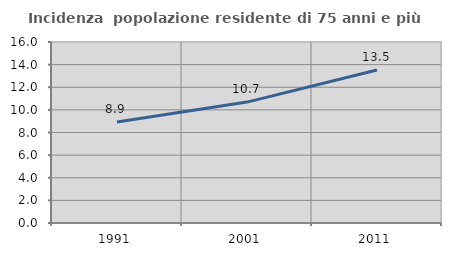
| Category | Incidenza  popolazione residente di 75 anni e più |
|---|---|
| 1991.0 | 8.922 |
| 2001.0 | 10.687 |
| 2011.0 | 13.525 |